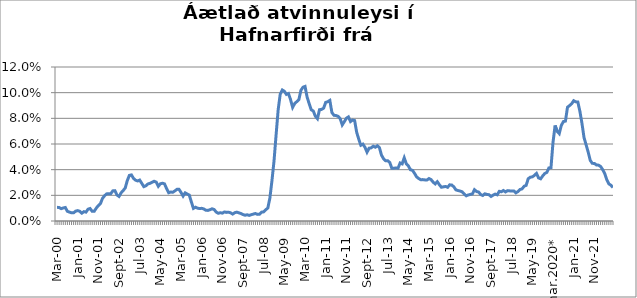
| Category | Series 0 |
|---|---|
| Mar-00 | 0.011 |
| Apr-00 | 0.011 |
| May-00 | 0.01 |
| Jun-00 | 0.01 |
| Jul-00 | 0.011 |
| Aug-00 | 0.008 |
| Sep-00 | 0.007 |
| Oct-00 | 0.006 |
| Nov-00 | 0.006 |
| Dec-00 | 0.008 |
| Jan-01 | 0.008 |
| Feb-01 | 0.008 |
| Mar-01 | 0.006 |
| Apr-01 | 0.007 |
| May-01 | 0.007 |
| Jun-01 | 0.009 |
| Jul-01 | 0.01 |
| Aug-01 | 0.008 |
| Sep-01 | 0.008 |
| Oct-01 | 0.01 |
| Nov-01 | 0.012 |
| Dec-01 | 0.014 |
| Jan-02 | 0.018 |
| Feb-02 | 0.02 |
| Mar-02 | 0.021 |
| Apr-02 | 0.021 |
| May-02 | 0.021 |
| Jun-02 | 0.023 |
| Jul-02 | 0.024 |
| Aug-02 | 0.02 |
| Sep-02 | 0.019 |
| Oct-02 | 0.022 |
| Nov-02 | 0.024 |
| Dec-02 | 0.026 |
| Jan-03 | 0.032 |
| Feb-03 | 0.036 |
| Mar-03 | 0.036 |
| Apr-03 | 0.033 |
| May-03 | 0.032 |
| Jun-03 | 0.031 |
| Jul-03 | 0.032 |
| Aug-03 | 0.029 |
| Sep-03 | 0.027 |
| Oct-03 | 0.027 |
| Nov-03 | 0.029 |
| Dec-03 | 0.029 |
| Jan-04 | 0.03 |
| Feb-04 | 0.031 |
| Mar-04 | 0.03 |
| Apr-04 | 0.027 |
| May-04 | 0.029 |
| Jun-04 | 0.029 |
| Jul-04 | 0.029 |
| Aug-04 | 0.025 |
| Sep-04 | 0.022 |
| Oct-04 | 0.023 |
| Nov-04 | 0.022 |
| Dec-04 | 0.023 |
| Jan-05 | 0.025 |
| Feb-05 | 0.025 |
| Mar-05 | 0.022 |
| Apr-05 | 0.019 |
| May-05 | 0.022 |
| Jun-05 | 0.021 |
| Jul-05 | 0.02 |
| Aug-05 | 0.015 |
| Sep-05 | 0.01 |
| Oct-05 | 0.011 |
| Nov-05 | 0.01 |
| Dec-05 | 0.01 |
| Jan-06 | 0.01 |
| Feb-06 | 0.009 |
| Mar-06 | 0.008 |
| Apr-06 | 0.008 |
| May-06 | 0.009 |
| Jun-06 | 0.009 |
| Jul-06 | 0.009 |
| Aug-06 | 0.007 |
| Sep-06 | 0.006 |
| Oct-06 | 0.006 |
| Nov-06 | 0.006 |
| Dec-06 | 0.007 |
| Jan-07 | 0.007 |
| Feb-07 | 0.007 |
| Mar-07 | 0.006 |
| Apr-07 | 0.005 |
| May-07 | 0.006 |
| Jun-07 | 0.007 |
| Jul-07 | 0.006 |
| Aug-07 | 0.006 |
| Sep-07 | 0.005 |
| Oct-07 | 0.005 |
| Nov-07 | 0.005 |
| Dec-07 | 0.004 |
| Jan-08 | 0.005 |
| Feb-08 | 0.005 |
| Mar-08 | 0.006 |
| Apr-08 | 0.005 |
| May-08 | 0.005 |
| Jun-08 | 0.007 |
| Jul-08 | 0.007 |
| Aug-08 | 0.009 |
| Sep-08 | 0.01 |
| Oct-08 | 0.018 |
| Nov-08 | 0.031 |
| Dec-08 | 0.047 |
| Jan-09 | 0.067 |
| Feb-09 | 0.087 |
| Mar-09 | 0.099 |
| Apr-09 | 0.102 |
| May-09 | 0.101 |
| Jun-09 | 0.099 |
| Jul-09 | 0.099 |
| Aug-09 | 0.095 |
| Sep-09 | 0.089 |
| Oct-09 | 0.092 |
| Nov-09 | 0.093 |
| Dec-09 | 0.094 |
| Jan-10 | 0.102 |
| Feb-10 | 0.104 |
| Mar-10 | 0.105 |
| Apr-10 | 0.097 |
| May-10 | 0.091 |
| Jun-10 | 0.087 |
| Jul-10 | 0.086 |
| Aug-10 | 0.082 |
| Sep-10 | 0.08 |
| Oct-10 | 0.087 |
| Nov-10 | 0.087 |
| Dec-10 | 0.088 |
| Jan-11 | 0.092 |
| Feb-11 | 0.093 |
| Mar-11 | 0.094 |
| Apr-11 | 0.084 |
| May-11 | 0.082 |
| Jun-11 | 0.082 |
| Jul-11 | 0.082 |
| Aug-11 | 0.08 |
| Sep-11 | 0.075 |
| Oct-11 | 0.077 |
| Nov-11 | 0.08 |
| Dec-11 | 0.081 |
| Jan-12 | 0.077 |
| Feb-12 | 0.079 |
| Mar-12 | 0.078 |
| Apr-12 | 0.069 |
| May-12 | 0.064 |
| Jun-12 | 0.059 |
| Jul-12 | 0.06 |
| Aug-12 | 0.057 |
| Sep-12 | 0.054 |
| Oct-12 | 0.057 |
| Nov-12 | 0.057 |
| Dec-12 | 0.058 |
| Jan-13 | 0.057 |
| Feb-13 | 0.059 |
| Mar-13 | 0.057 |
| Apr-13 | 0.051 |
| May-13 | 0.049 |
| Jun-13 | 0.047 |
| Jul-13 | 0.047 |
| Aug-13 | 0.046 |
| Sep-13 | 0.041 |
| Oct-13 | 0.041 |
| Nov-13 | 0.041 |
| Dec-13 | 0.041 |
| Jan-14 | 0.045 |
| Feb-14 | 0.045 |
| Mar-14 | 0.049 |
| Apr-14 | 0.045 |
| May-14 | 0.043 |
| Jun-14 | 0.04 |
| Jul-14 | 0.039 |
| Aug-14 | 0.037 |
| Sep-14 | 0.034 |
| Oct-14 | 0.033 |
| Nov-14 | 0.032 |
| Dec-14 | 0.032 |
| Jan-15 | 0.032 |
| Feb-15 | 0.032 |
| Mar-15 | 0.033 |
| Apr-15 | 0.032 |
| May-15 | 0.03 |
| Jun-15 | 0.029 |
| Jul-15 | 0.031 |
| Aug-15 | 0.028 |
| Sep-15 | 0.026 |
| Oct-15 | 0.027 |
| Nov-15 | 0.027 |
| Dec-15 | 0.026 |
| Jan-16 | 0.028 |
| Feb-16 | 0.028 |
| Mar-16 | 0.027 |
| Apr-16 | 0.024 |
| May-16 | 0.024 |
| Jun-16 | 0.023 |
| Jul-16 | 0.023 |
| Aug-16 | 0.021 |
| Sep-16 | 0.02 |
| Oct-16 | 0.02 |
| Nov-16 | 0.021 |
| Dec-16 | 0.021 |
| Jan-17 | 0.024 |
| Feb-17 | 0.023 |
| Mar-17 | 0.023 |
| Apr-17 | 0.021 |
| May-17 | 0.02 |
| Jun-17 | 0.021 |
| Jul-17 | 0.021 |
| Aug-17 | 0.02 |
| Sep-17 | 0.019 |
| Oct-17 | 0.02 |
| Nov-17 | 0.021 |
| Dec-17 | 0.02 |
| Jan-18 | 0.023 |
| Feb-18 | 0.023 |
| Mar-18 | 0.024 |
| Apr-18 | 0.023 |
| May-18 | 0.024 |
| Jun-18 | 0.023 |
| Jul-18 | 0.023 |
| Aug-18 | 0.023 |
| Sep-18 | 0.022 |
| Oct-18 | 0.023 |
| Nov-18 | 0.025 |
| Dec-18 | 0.025 |
| Jan-19 | 0.027 |
| Feb-19 | 0.028 |
| Mar-19 | 0.033 |
| Apr-19 | 0.034 |
| May-19 | 0.034 |
| Jun-19 | 0.036 |
| Jul-19 | 0.037 |
| Aug-19 | 0.034 |
| Sep-19 | 0.033 |
| Oct-19 | 0.035 |
| Nov-19 | 0.037 |
| Dec-19 | 0.038 |
| Jan-20 | 0.041 |
| Feb-20 | 0.042 |
| mar.2020* | 0.061 |
| Apr-20 | 0.074 |
| Maí - 20 | 0.07 |
| Jun-20 | 0.068 |
| Jul-20 | 0.074 |
| Aug-20 | 0.077 |
| Sep-20 | 0.078 |
| okt. 20 | 0.089 |
| Nov-20 | 0.09 |
| Dec-20 | 0.091 |
| Jan-21 | 0.094 |
| Feb-21 | 0.093 |
| Mar-21 | 0.093 |
| Apr-21 | 0.085 |
| May-21 | 0.076 |
| Jun-21 | 0.065 |
| Jul-21 | 0.059 |
| Aug-21 | 0.054 |
| Sep-21 | 0.047 |
| Oct-21 | 0.045 |
| Nov-21 | 0.045 |
| Dec-21 | 0.044 |
| Jan-22 | 0.044 |
| Feb-22 | 0.043 |
| Mar-22 | 0.04 |
| Apr-22 | 0.037 |
| May-22 | 0.032 |
| Jun-22 | 0.029 |
| Jul-22 | 0.028 |
| Aug-22 | 0.026 |